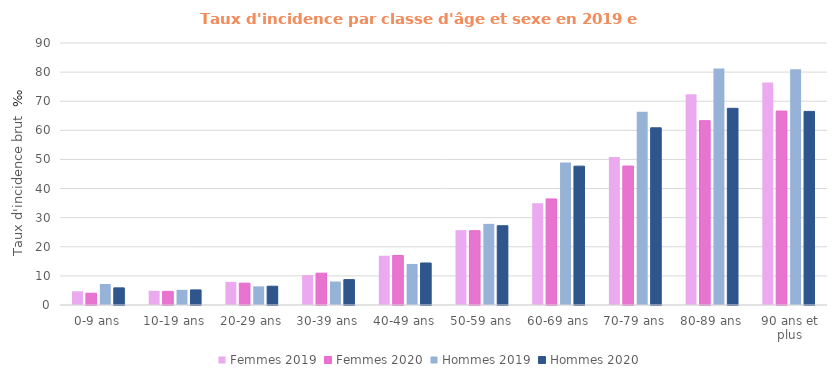
| Category | Femmes 2019 | Femmes 2020 | Hommes 2019 | Hommes 2020 |
|---|---|---|---|---|
| 0-9 ans | 4.719 | 4.05 | 7.224 | 5.888 |
| 10-19 ans | 4.867 | 4.684 | 5.211 | 5.184 |
| 20-29 ans | 7.933 | 7.498 | 6.405 | 6.447 |
| 30-39 ans | 10.279 | 10.925 | 8.063 | 8.723 |
| 40-49 ans | 16.932 | 17.002 | 14.1 | 14.432 |
| 50-59 ans | 25.713 | 25.52 | 27.87 | 27.233 |
| 60-69 ans | 34.965 | 36.438 | 48.924 | 47.698 |
| 70-79 ans | 50.842 | 47.734 | 66.362 | 60.869 |
| 80-89 ans | 72.416 | 63.313 | 81.24 | 67.561 |
| 90 ans et plus | 76.419 | 66.623 | 80.983 | 66.505 |